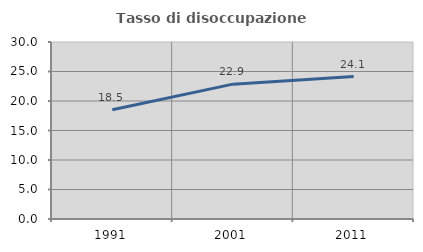
| Category | Tasso di disoccupazione giovanile  |
|---|---|
| 1991.0 | 18.519 |
| 2001.0 | 22.857 |
| 2011.0 | 24.138 |